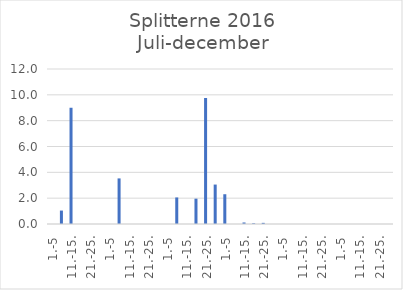
| Category | Series 0 |
|---|---|
| 1.-5 | 0 |
| 6.-10. | 1.041 |
| 11.-15. | 9 |
| 16.-20. | 0 |
| 21.-25. | 0 |
| 26.-31. | 0 |
| 1.-5 | 0 |
| 6.-10. | 3.53 |
| 11.-15. | 0 |
| 16.-20. | 0 |
| 21.-25. | 0 |
| 26.-31. | 0 |
| 1.-5 | 0 |
| 6.-10. | 2.056 |
| 11.-15. | 0 |
| 16.-20. | 1.961 |
| 21.-25. | 9.755 |
| 26.-30. | 3.054 |
| 1.-5 | 2.305 |
| 6.-10. | 0 |
| 11.-15. | 0.118 |
| 16.-20. | 0.056 |
| 21.-25. | 0.089 |
| 26.-31. | 0 |
| 1.-5 | 0 |
| 6.-10. | 0 |
| 11.-15. | 0 |
| 16.-20. | 0 |
| 21.-25. | 0 |
| 26.-30. | 0 |
| 1.-5 | 0 |
| 6.-10. | 0 |
| 11.-15. | 0 |
| 16.-20. | 0 |
| 21.-25. | 0 |
| 26.-31. | 0 |